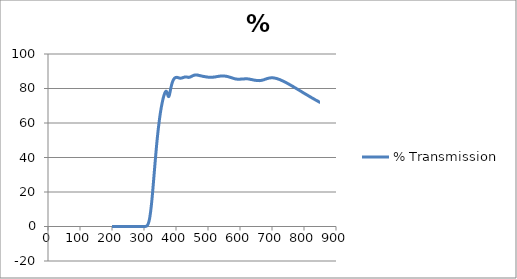
| Category | % Transmission |
|---|---|
| 850.0 | 72.008 |
| 849.0 | 72.01 |
| 848.0 | 72.136 |
| 847.0 | 72.237 |
| 846.0 | 72.364 |
| 845.0 | 72.419 |
| 844.0 | 72.605 |
| 843.0 | 72.618 |
| 842.0 | 72.792 |
| 841.0 | 72.93 |
| 840.0 | 72.947 |
| 839.0 | 73.055 |
| 838.0 | 73.143 |
| 837.0 | 73.235 |
| 836.0 | 73.36 |
| 835.0 | 73.478 |
| 834.0 | 73.596 |
| 833.0 | 73.716 |
| 832.0 | 73.806 |
| 831.0 | 73.865 |
| 830.0 | 74.009 |
| 829.0 | 74.136 |
| 828.0 | 74.208 |
| 827.0 | 74.345 |
| 826.0 | 74.465 |
| 825.0 | 74.571 |
| 824.0 | 74.636 |
| 823.0 | 74.772 |
| 822.0 | 74.839 |
| 821.0 | 74.987 |
| 820.0 | 75.114 |
| 819.0 | 75.181 |
| 818.0 | 75.324 |
| 817.0 | 75.419 |
| 816.0 | 75.488 |
| 815.0 | 75.642 |
| 814.0 | 75.739 |
| 813.0 | 75.859 |
| 812.0 | 75.975 |
| 811.0 | 76.096 |
| 810.0 | 76.162 |
| 809.0 | 76.309 |
| 808.0 | 76.4 |
| 807.0 | 76.532 |
| 806.0 | 76.663 |
| 805.0 | 76.728 |
| 804.0 | 76.86 |
| 803.0 | 76.959 |
| 802.0 | 77.062 |
| 801.0 | 77.198 |
| 800.0 | 77.286 |
| 799.0 | 77.39 |
| 798.0 | 77.491 |
| 797.0 | 77.641 |
| 796.0 | 77.725 |
| 795.0 | 77.826 |
| 794.0 | 77.989 |
| 793.0 | 78.068 |
| 792.0 | 78.208 |
| 791.0 | 78.32 |
| 790.0 | 78.408 |
| 789.0 | 78.537 |
| 788.0 | 78.647 |
| 787.0 | 78.751 |
| 786.0 | 78.88 |
| 785.0 | 79.005 |
| 784.0 | 79.091 |
| 783.0 | 79.21 |
| 782.0 | 79.334 |
| 781.0 | 79.436 |
| 780.0 | 79.555 |
| 779.0 | 79.66 |
| 778.0 | 79.718 |
| 777.0 | 79.887 |
| 776.0 | 79.963 |
| 775.0 | 80.111 |
| 774.0 | 80.223 |
| 773.0 | 80.343 |
| 772.0 | 80.422 |
| 771.0 | 80.528 |
| 770.0 | 80.68 |
| 769.0 | 80.766 |
| 768.0 | 80.894 |
| 767.0 | 81.004 |
| 766.0 | 81.084 |
| 765.0 | 81.231 |
| 764.0 | 81.326 |
| 763.0 | 81.448 |
| 762.0 | 81.546 |
| 761.0 | 81.656 |
| 760.0 | 81.72 |
| 759.0 | 81.859 |
| 758.0 | 81.979 |
| 757.0 | 82.059 |
| 756.0 | 82.19 |
| 755.0 | 82.285 |
| 754.0 | 82.372 |
| 753.0 | 82.506 |
| 752.0 | 82.585 |
| 751.0 | 82.677 |
| 750.0 | 82.809 |
| 749.0 | 82.908 |
| 748.0 | 82.965 |
| 747.0 | 83.098 |
| 746.0 | 83.2 |
| 745.0 | 83.304 |
| 744.0 | 83.394 |
| 743.0 | 83.504 |
| 742.0 | 83.563 |
| 741.0 | 83.697 |
| 740.0 | 83.787 |
| 739.0 | 83.881 |
| 738.0 | 83.991 |
| 737.0 | 84.072 |
| 736.0 | 84.13 |
| 735.0 | 84.246 |
| 734.0 | 84.344 |
| 733.0 | 84.411 |
| 732.0 | 84.512 |
| 731.0 | 84.571 |
| 730.0 | 84.654 |
| 729.0 | 84.765 |
| 728.0 | 84.846 |
| 727.0 | 84.927 |
| 726.0 | 84.991 |
| 725.0 | 85.121 |
| 724.0 | 85.166 |
| 723.0 | 85.266 |
| 722.0 | 85.301 |
| 721.0 | 85.352 |
| 720.0 | 85.443 |
| 719.0 | 85.499 |
| 718.0 | 85.54 |
| 717.0 | 85.629 |
| 716.0 | 85.719 |
| 715.0 | 85.758 |
| 714.0 | 85.832 |
| 713.0 | 85.846 |
| 712.0 | 85.867 |
| 711.0 | 85.945 |
| 710.0 | 85.987 |
| 709.0 | 86.017 |
| 708.0 | 86.056 |
| 707.0 | 86.073 |
| 706.0 | 86.09 |
| 705.0 | 86.139 |
| 704.0 | 86.165 |
| 703.0 | 86.174 |
| 702.0 | 86.202 |
| 701.0 | 86.189 |
| 700.0 | 86.199 |
| 699.0 | 86.218 |
| 698.0 | 86.214 |
| 697.0 | 86.192 |
| 696.0 | 86.171 |
| 695.0 | 86.153 |
| 694.0 | 86.103 |
| 693.0 | 86.088 |
| 692.0 | 86.085 |
| 691.0 | 86.032 |
| 690.0 | 86.012 |
| 689.0 | 85.972 |
| 688.0 | 85.895 |
| 687.0 | 85.817 |
| 686.0 | 85.801 |
| 685.0 | 85.763 |
| 684.0 | 85.689 |
| 683.0 | 85.618 |
| 682.0 | 85.544 |
| 681.0 | 85.48 |
| 680.0 | 85.443 |
| 679.0 | 85.391 |
| 678.0 | 85.294 |
| 677.0 | 85.252 |
| 676.0 | 85.172 |
| 675.0 | 85.101 |
| 674.0 | 85.051 |
| 673.0 | 85.001 |
| 672.0 | 84.953 |
| 671.0 | 84.881 |
| 670.0 | 84.826 |
| 669.0 | 84.791 |
| 668.0 | 84.773 |
| 667.0 | 84.746 |
| 666.0 | 84.693 |
| 665.0 | 84.66 |
| 664.0 | 84.633 |
| 663.0 | 84.608 |
| 662.0 | 84.607 |
| 661.0 | 84.587 |
| 660.0 | 84.558 |
| 659.0 | 84.601 |
| 658.0 | 84.588 |
| 657.0 | 84.563 |
| 656.0 | 84.592 |
| 655.0 | 84.601 |
| 654.0 | 84.607 |
| 653.0 | 84.633 |
| 652.0 | 84.64 |
| 651.0 | 84.68 |
| 650.0 | 84.729 |
| 649.0 | 84.706 |
| 648.0 | 84.726 |
| 647.0 | 84.796 |
| 646.0 | 84.803 |
| 645.0 | 84.825 |
| 644.0 | 84.883 |
| 643.0 | 84.92 |
| 642.0 | 84.941 |
| 641.0 | 84.988 |
| 640.0 | 85.023 |
| 639.0 | 85.06 |
| 638.0 | 85.125 |
| 637.0 | 85.16 |
| 636.0 | 85.189 |
| 635.0 | 85.242 |
| 634.0 | 85.248 |
| 633.0 | 85.282 |
| 632.0 | 85.35 |
| 631.0 | 85.374 |
| 630.0 | 85.407 |
| 629.0 | 85.459 |
| 628.0 | 85.455 |
| 627.0 | 85.482 |
| 626.0 | 85.532 |
| 625.0 | 85.555 |
| 624.0 | 85.581 |
| 623.0 | 85.583 |
| 622.0 | 85.582 |
| 621.0 | 85.592 |
| 620.0 | 85.601 |
| 619.0 | 85.617 |
| 618.0 | 85.623 |
| 617.0 | 85.628 |
| 616.0 | 85.595 |
| 615.0 | 85.569 |
| 614.0 | 85.593 |
| 613.0 | 85.573 |
| 612.0 | 85.554 |
| 611.0 | 85.569 |
| 610.0 | 85.536 |
| 609.0 | 85.518 |
| 608.0 | 85.537 |
| 607.0 | 85.495 |
| 606.0 | 85.481 |
| 605.0 | 85.496 |
| 604.0 | 85.441 |
| 603.0 | 85.423 |
| 602.0 | 85.446 |
| 601.0 | 85.422 |
| 600.0 | 85.431 |
| 599.0 | 85.424 |
| 598.0 | 85.405 |
| 597.0 | 85.385 |
| 596.0 | 85.407 |
| 595.0 | 85.39 |
| 594.0 | 85.381 |
| 593.0 | 85.396 |
| 592.0 | 85.384 |
| 591.0 | 85.396 |
| 590.0 | 85.459 |
| 589.0 | 85.461 |
| 588.0 | 85.491 |
| 587.0 | 85.531 |
| 586.0 | 85.535 |
| 585.0 | 85.585 |
| 584.0 | 85.66 |
| 583.0 | 85.677 |
| 582.0 | 85.722 |
| 581.0 | 85.799 |
| 580.0 | 85.832 |
| 579.0 | 85.883 |
| 578.0 | 85.957 |
| 577.0 | 86.028 |
| 576.0 | 86.105 |
| 575.0 | 86.148 |
| 574.0 | 86.203 |
| 573.0 | 86.259 |
| 572.0 | 86.341 |
| 571.0 | 86.391 |
| 570.0 | 86.425 |
| 569.0 | 86.518 |
| 568.0 | 86.565 |
| 567.0 | 86.592 |
| 566.0 | 86.701 |
| 565.0 | 86.731 |
| 564.0 | 86.787 |
| 563.0 | 86.874 |
| 562.0 | 86.877 |
| 561.0 | 86.936 |
| 560.0 | 86.936 |
| 559.0 | 87.012 |
| 558.0 | 87.068 |
| 557.0 | 87.072 |
| 556.0 | 87.129 |
| 555.0 | 87.156 |
| 554.0 | 87.146 |
| 553.0 | 87.181 |
| 552.0 | 87.22 |
| 551.0 | 87.24 |
| 550.0 | 87.257 |
| 549.0 | 87.272 |
| 548.0 | 87.257 |
| 547.0 | 87.255 |
| 546.0 | 87.303 |
| 545.0 | 87.277 |
| 544.0 | 87.265 |
| 543.0 | 87.265 |
| 542.0 | 87.197 |
| 541.0 | 87.211 |
| 540.0 | 87.219 |
| 539.0 | 87.199 |
| 538.0 | 87.209 |
| 537.0 | 87.151 |
| 536.0 | 87.121 |
| 535.0 | 87.085 |
| 534.0 | 87.084 |
| 533.0 | 87.076 |
| 532.0 | 87.012 |
| 531.0 | 86.983 |
| 530.0 | 86.935 |
| 529.0 | 86.888 |
| 528.0 | 86.916 |
| 527.0 | 86.873 |
| 526.0 | 86.844 |
| 525.0 | 86.821 |
| 524.0 | 86.733 |
| 523.0 | 86.731 |
| 522.0 | 86.733 |
| 521.0 | 86.657 |
| 520.0 | 86.645 |
| 519.0 | 86.649 |
| 518.0 | 86.588 |
| 517.0 | 86.617 |
| 516.0 | 86.603 |
| 515.0 | 86.552 |
| 514.0 | 86.56 |
| 513.0 | 86.537 |
| 512.0 | 86.525 |
| 511.0 | 86.48 |
| 510.0 | 86.561 |
| 509.0 | 86.511 |
| 508.0 | 86.525 |
| 507.0 | 86.541 |
| 506.0 | 86.483 |
| 505.0 | 86.542 |
| 504.0 | 86.596 |
| 503.0 | 86.516 |
| 502.0 | 86.585 |
| 501.0 | 86.569 |
| 500.0 | 86.569 |
| 499.0 | 86.624 |
| 498.0 | 86.694 |
| 497.0 | 86.647 |
| 496.0 | 86.708 |
| 495.0 | 86.74 |
| 494.0 | 86.716 |
| 493.0 | 86.745 |
| 492.0 | 86.841 |
| 491.0 | 86.801 |
| 490.0 | 86.902 |
| 489.0 | 86.896 |
| 488.0 | 86.896 |
| 487.0 | 86.977 |
| 486.0 | 87.017 |
| 485.0 | 86.999 |
| 484.0 | 87.107 |
| 483.0 | 87.105 |
| 482.0 | 87.15 |
| 481.0 | 87.186 |
| 480.0 | 87.265 |
| 479.0 | 87.258 |
| 478.0 | 87.325 |
| 477.0 | 87.38 |
| 476.0 | 87.383 |
| 475.0 | 87.435 |
| 474.0 | 87.51 |
| 473.0 | 87.541 |
| 472.0 | 87.561 |
| 471.0 | 87.637 |
| 470.0 | 87.628 |
| 469.0 | 87.685 |
| 468.0 | 87.788 |
| 467.0 | 87.732 |
| 466.0 | 87.831 |
| 465.0 | 87.796 |
| 464.0 | 87.784 |
| 463.0 | 87.819 |
| 462.0 | 87.828 |
| 461.0 | 87.829 |
| 460.0 | 87.785 |
| 459.0 | 87.814 |
| 458.0 | 87.714 |
| 457.0 | 87.705 |
| 456.0 | 87.675 |
| 455.0 | 87.584 |
| 454.0 | 87.537 |
| 453.0 | 87.447 |
| 452.0 | 87.354 |
| 451.0 | 87.246 |
| 450.0 | 87.196 |
| 449.0 | 87.053 |
| 448.0 | 86.99 |
| 447.0 | 86.904 |
| 446.0 | 86.742 |
| 445.0 | 86.727 |
| 444.0 | 86.612 |
| 443.0 | 86.545 |
| 442.0 | 86.518 |
| 441.0 | 86.488 |
| 440.0 | 86.434 |
| 439.0 | 86.427 |
| 438.0 | 86.516 |
| 437.0 | 86.46 |
| 436.0 | 86.574 |
| 435.0 | 86.61 |
| 434.0 | 86.602 |
| 433.0 | 86.626 |
| 432.0 | 86.729 |
| 431.0 | 86.652 |
| 430.0 | 86.708 |
| 429.0 | 86.703 |
| 428.0 | 86.605 |
| 427.0 | 86.643 |
| 426.0 | 86.562 |
| 425.0 | 86.474 |
| 424.0 | 86.466 |
| 423.0 | 86.374 |
| 422.0 | 86.347 |
| 421.0 | 86.269 |
| 420.0 | 86.178 |
| 419.0 | 86.137 |
| 418.0 | 86.076 |
| 417.0 | 86.048 |
| 416.0 | 86.033 |
| 415.0 | 85.968 |
| 414.0 | 85.992 |
| 413.0 | 85.956 |
| 412.0 | 85.986 |
| 411.0 | 86.051 |
| 410.0 | 86.083 |
| 409.0 | 86.146 |
| 408.0 | 86.187 |
| 407.0 | 86.24 |
| 406.0 | 86.31 |
| 405.0 | 86.405 |
| 404.0 | 86.422 |
| 403.0 | 86.473 |
| 402.0 | 86.45 |
| 401.0 | 86.421 |
| 400.0 | 86.432 |
| 399.0 | 86.38 |
| 398.0 | 86.324 |
| 397.0 | 86.164 |
| 396.0 | 86.029 |
| 395.0 | 85.834 |
| 394.0 | 85.628 |
| 393.0 | 85.357 |
| 392.0 | 85.073 |
| 391.0 | 84.673 |
| 390.0 | 84.273 |
| 389.0 | 83.814 |
| 388.0 | 83.206 |
| 387.0 | 82.611 |
| 386.0 | 81.889 |
| 385.0 | 81.125 |
| 384.0 | 80.334 |
| 383.0 | 79.393 |
| 382.0 | 78.457 |
| 381.0 | 77.548 |
| 380.0 | 76.71 |
| 379.0 | 75.981 |
| 378.0 | 75.468 |
| 377.0 | 75.277 |
| 376.0 | 75.416 |
| 375.0 | 75.829 |
| 374.0 | 76.381 |
| 373.0 | 77.022 |
| 372.0 | 77.594 |
| 371.0 | 78.029 |
| 370.0 | 78.31 |
| 369.0 | 78.437 |
| 368.0 | 78.295 |
| 367.0 | 78.114 |
| 366.0 | 77.78 |
| 365.0 | 77.337 |
| 364.0 | 76.885 |
| 363.0 | 76.35 |
| 362.0 | 75.713 |
| 361.0 | 75.085 |
| 360.0 | 74.352 |
| 359.0 | 73.565 |
| 358.0 | 72.774 |
| 357.0 | 71.913 |
| 356.0 | 70.944 |
| 355.0 | 70.009 |
| 354.0 | 69.001 |
| 353.0 | 67.938 |
| 352.0 | 66.828 |
| 351.0 | 65.648 |
| 350.0 | 64.377 |
| 349.0 | 63.064 |
| 348.0 | 61.644 |
| 347.0 | 60.141 |
| 346.0 | 58.664 |
| 345.0 | 57.102 |
| 344.0 | 55.453 |
| 343.0 | 53.779 |
| 342.0 | 52.011 |
| 341.0 | 50.189 |
| 340.0 | 48.283 |
| 339.0 | 46.308 |
| 338.0 | 44.225 |
| 337.0 | 42.106 |
| 336.0 | 39.953 |
| 335.0 | 37.765 |
| 334.0 | 35.585 |
| 333.0 | 33.388 |
| 332.0 | 31.176 |
| 331.0 | 28.935 |
| 330.0 | 26.671 |
| 329.0 | 24.437 |
| 328.0 | 22.214 |
| 327.0 | 20.033 |
| 326.0 | 17.938 |
| 325.0 | 15.945 |
| 324.0 | 14.049 |
| 323.0 | 12.274 |
| 322.0 | 10.612 |
| 321.0 | 9.062 |
| 320.0 | 7.636 |
| 319.0 | 6.335 |
| 318.0 | 5.193 |
| 317.0 | 4.21 |
| 316.0 | 3.34 |
| 315.0 | 2.608 |
| 314.0 | 2.008 |
| 313.0 | 1.515 |
| 312.0 | 1.116 |
| 311.0 | 0.8 |
| 310.0 | 0.557 |
| 309.0 | 0.376 |
| 308.0 | 0.249 |
| 307.0 | 0.158 |
| 306.0 | 0.099 |
| 305.0 | 0.059 |
| 304.0 | 0.032 |
| 303.0 | 0.018 |
| 302.0 | 0.011 |
| 301.0 | 0.006 |
| 300.0 | 0.003 |
| 299.0 | 0.001 |
| 298.0 | -0.002 |
| 297.0 | 0 |
| 296.0 | 0.001 |
| 295.0 | -0.001 |
| 294.0 | 0.002 |
| 293.0 | 0.001 |
| 292.0 | -0.002 |
| 291.0 | 0.002 |
| 290.0 | 0.003 |
| 289.0 | -0.002 |
| 288.0 | -0.002 |
| 287.0 | 0 |
| 286.0 | 0.001 |
| 285.0 | 0.001 |
| 284.0 | 0 |
| 283.0 | 0.001 |
| 282.0 | 0.001 |
| 281.0 | -0.001 |
| 280.0 | -0.003 |
| 279.0 | 0 |
| 278.0 | 0.002 |
| 277.0 | 0 |
| 276.0 | 0.002 |
| 275.0 | 0.001 |
| 274.0 | -0.001 |
| 273.0 | 0.002 |
| 272.0 | 0.002 |
| 271.0 | 0 |
| 270.0 | 0.002 |
| 269.0 | 0.001 |
| 268.0 | -0.002 |
| 267.0 | 0.001 |
| 266.0 | 0.001 |
| 265.0 | 0 |
| 264.0 | 0.002 |
| 263.0 | 0.001 |
| 262.0 | -0.001 |
| 261.0 | 0.001 |
| 260.0 | 0.001 |
| 259.0 | -0.001 |
| 258.0 | 0.001 |
| 257.0 | -0.001 |
| 256.0 | -0.001 |
| 255.0 | 0 |
| 254.0 | -0.002 |
| 253.0 | -0.001 |
| 252.0 | 0.003 |
| 251.0 | 0.002 |
| 250.0 | 0 |
| 249.0 | 0.002 |
| 248.0 | 0 |
| 247.0 | 0 |
| 246.0 | 0.002 |
| 245.0 | -0.001 |
| 244.0 | -0.003 |
| 243.0 | -0.001 |
| 242.0 | -0.002 |
| 241.0 | 0 |
| 240.0 | 0.003 |
| 239.0 | 0 |
| 238.0 | -0.002 |
| 237.0 | -0.001 |
| 236.0 | -0.001 |
| 235.0 | 0 |
| 234.0 | 0.002 |
| 233.0 | 0 |
| 232.0 | -0.002 |
| 231.0 | 0.001 |
| 230.0 | -0.001 |
| 229.0 | 0 |
| 228.0 | 0.003 |
| 227.0 | 0.001 |
| 226.0 | -0.001 |
| 225.0 | -0.001 |
| 224.0 | -0.002 |
| 223.0 | 0 |
| 222.0 | 0.002 |
| 221.0 | 0.001 |
| 220.0 | -0.001 |
| 219.0 | 0 |
| 218.0 | -0.001 |
| 217.0 | 0 |
| 216.0 | 0.002 |
| 215.0 | 0 |
| 214.0 | -0.001 |
| 213.0 | 0 |
| 212.0 | -0.002 |
| 211.0 | 0.001 |
| 210.0 | 0.002 |
| 209.0 | 0 |
| 208.0 | -0.003 |
| 207.0 | 0.001 |
| 206.0 | 0 |
| 205.0 | -0.002 |
| 204.0 | 0 |
| 203.0 | -0.001 |
| 202.0 | 0 |
| 201.0 | 0 |
| 200.0 | -0.004 |